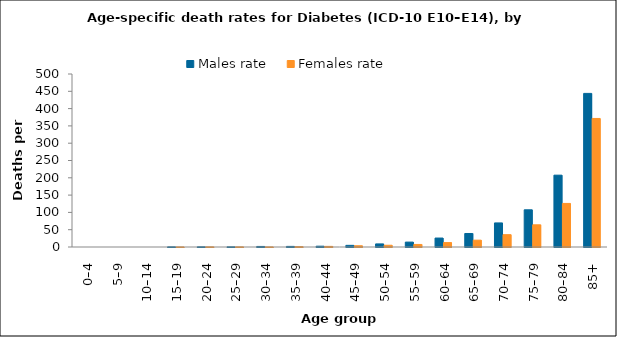
| Category | Males rate | Females rate |
|---|---|---|
| 0–4 | 0 | 0 |
| 5–9 | 0 | 0 |
| 10–14 | 0 | 0 |
| 15–19 | 0.394 | 0.139 |
| 20–24 | 0.478 | 0.382 |
| 25–29 | 0.436 | 0.332 |
| 30–34 | 1.595 | 0.209 |
| 35–39 | 1.724 | 1.065 |
| 40–44 | 2.329 | 1.789 |
| 45–49 | 4.772 | 3.603 |
| 50–54 | 8.94 | 5.016 |
| 55–59 | 14.163 | 7.361 |
| 60–64 | 25.872 | 12.735 |
| 65–69 | 39.026 | 19.77 |
| 70–74 | 69.588 | 35.637 |
| 75–79 | 107.518 | 64.146 |
| 80–84 | 207.632 | 125.911 |
| 85+ | 443.929 | 371.494 |